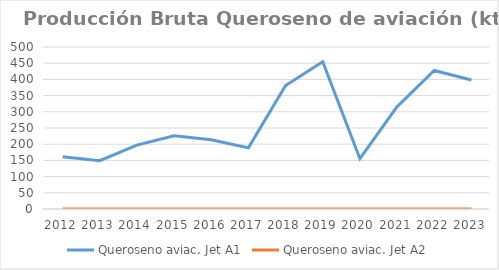
| Category | Queroseno aviac. Jet A1 | Queroseno aviac. Jet A2 |
|---|---|---|
| 2012.0 | 161.524 | 0.065 |
| 2013.0 | 148.95 | 0.022 |
| 2014.0 | 197.209 | 0.03 |
| 2015.0 | 225.935 | 0 |
| 2016.0 | 213.608 | 0 |
| 2017.0 | 188.614 | 0 |
| 2018.0 | 380.855 | 0 |
| 2019.0 | 454.21 | 0 |
| 2020.0 | 155.319 | 0 |
| 2021.0 | 315.619 | 0 |
| 2022.0 | 427.493 | 0 |
| 2023.0 | 398.375 | 0 |